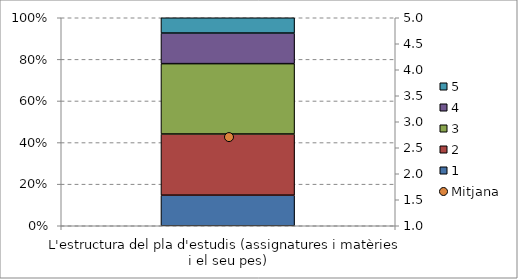
| Category | 1 | 2 | 3 | 4 | 5 |
|---|---|---|---|---|---|
| L'estructura del pla d'estudis (assignatures i matèries i el seu pes) | 10 | 20 | 23 | 10 | 5 |